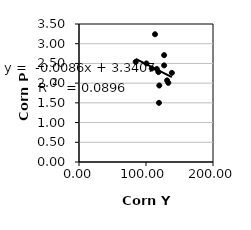
| Category | Series 0 |
|---|---|
| 119.3748675751375 | 1.5 |
| 119.84371061255356 | 1.94 |
| 84.61254935622317 | 2.54 |
| 116.16462652239014 | 2.36 |
| 118.50322619189868 | 2.28 |
| 108.58105654567375 | 2.37 |
| 131.48019479168113 | 2.07 |
| 100.70516997504808 | 2.5 |
| 138.6081880170675 | 2.26 |
| 113.45297330563889 | 3.24 |
| 127.05148536508675 | 2.71 |
| 127.04251220835594 | 2.45 |
| 133.29993630486928 | 2.007 |